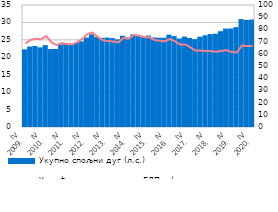
| Category | Укупно спољни дуг (л.с.) |
|---|---|
| IV
2009. | 22.272 |
| I | 23.09 |
| II | 23.254 |
| III | 22.861 |
| IV
2010. | 23.509 |
| I | 22.384 |
| II | 22.4 |
| III | 23.676 |
| IV
2011. | 24.123 |
| I | 23.947 |
| II | 24.124 |
| III | 24.565 |
| IV
2012. | 25.645 |
| I | 26.582 |
| II | 25.858 |
| III | 25.582 |
| IV
2013. | 25.644 |
| I | 25.497 |
| II | 25.144 |
| III | 26.171 |
| IV
2014. | 25.679 |
| I | 26.552 |
| II | 26.348 |
| III | 26.111 |
| IV
2015. | 26.234 |
| I | 25.682 |
| II | 25.621 |
| III | 25.603 |
| IV
2016. | 26.494 |
| I | 26.088 |
| II | 25.385 |
| III | 25.946 |
| IV
2017. | 25.526 |
| I | 25.216 |
| II | 25.906 |
| III | 26.312 |
| IV
2018. | 26.662 |
| I | 26.764 |
| II | 27.476 |
| III | 28.227 |
| IV
2019. | 28.254 |
| I | 28.655 |
| II | 30.959 |
| III | 30.719 |
| IV
2020. | 30.813 |